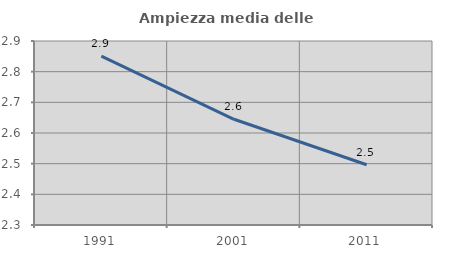
| Category | Ampiezza media delle famiglie |
|---|---|
| 1991.0 | 2.851 |
| 2001.0 | 2.645 |
| 2011.0 | 2.497 |